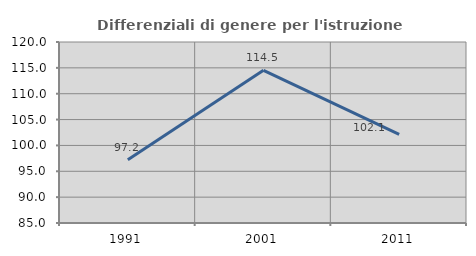
| Category | Differenziali di genere per l'istruzione superiore |
|---|---|
| 1991.0 | 97.214 |
| 2001.0 | 114.521 |
| 2011.0 | 102.128 |